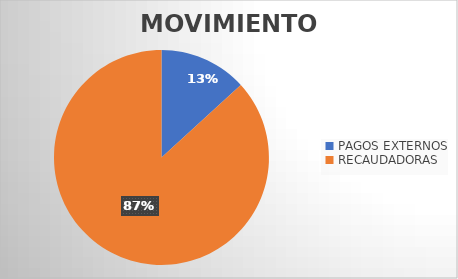
| Category | MOVIMIENTOS |
|---|---|
| PAGOS EXTERNOS | 9405 |
| RECAUDADORAS | 61822 |